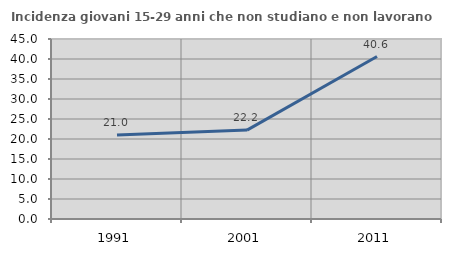
| Category | Incidenza giovani 15-29 anni che non studiano e non lavorano  |
|---|---|
| 1991.0 | 21.014 |
| 2001.0 | 22.222 |
| 2011.0 | 40.625 |